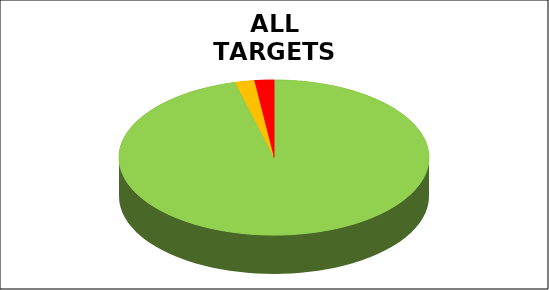
| Category | Series 0 |
|---|---|
| Green | 0.96 |
| Amber | 0.02 |
| Red | 0.02 |